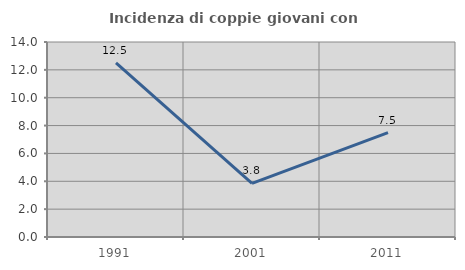
| Category | Incidenza di coppie giovani con figli |
|---|---|
| 1991.0 | 12.5 |
| 2001.0 | 3.846 |
| 2011.0 | 7.5 |